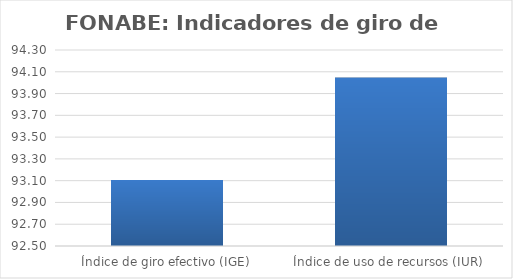
| Category | Series 0 |
|---|---|
| Índice de giro efectivo (IGE) | 93.106 |
| Índice de uso de recursos (IUR)  | 94.047 |